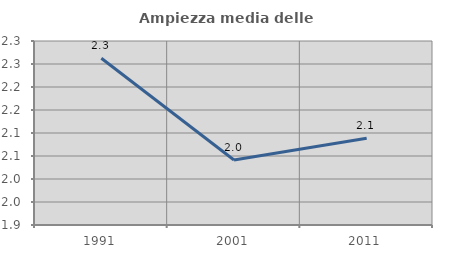
| Category | Ampiezza media delle famiglie |
|---|---|
| 1991.0 | 2.262 |
| 2001.0 | 2.041 |
| 2011.0 | 2.089 |